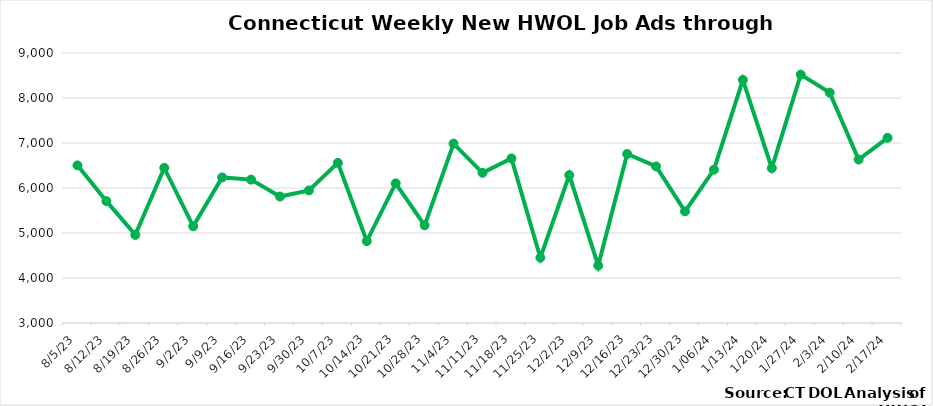
| Category | Connecticut |
|---|---|
| 8/5/23 | 6503 |
| 8/12/23 | 5708 |
| 8/19/23 | 4958 |
| 8/26/23 | 6447 |
| 9/2/23 | 5149 |
| 9/9/23 | 6235 |
| 9/16/23 | 6186 |
| 9/23/23 | 5810 |
| 9/30/23 | 5946 |
| 10/7/23 | 6558 |
| 10/14/23 | 4820 |
| 10/21/23 | 6103 |
| 10/28/23 | 5171 |
| 11/4/23 | 6987 |
| 11/11/23 | 6338 |
| 11/18/23 | 6658 |
| 11/25/23 | 4451 |
| 12/2/23 | 6286 |
| 12/9/23 | 4276 |
| 12/16/23 | 6757 |
|  12/23/23 | 6479 |
|  12/30/23 | 5482 |
|  1/06/24 | 6407 |
|  1/13/24 | 8403 |
|  1/20/24 | 6441 |
|  1/27/24 | 8521 |
|  2/3/24 | 8120 |
|  2/10/24 | 6632 |
|  2/17/24 | 7115 |